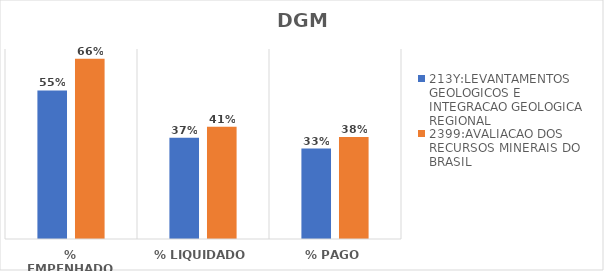
| Category | 213Y:LEVANTAMENTOS GEOLOGICOS E INTEGRACAO GEOLOGICA REGIONAL | 2399:AVALIACAO DOS RECURSOS MINERAIS DO BRASIL |
|---|---|---|
| % EMPENHADO | 0.547 | 0.664 |
| % LIQUIDADO | 0.373 | 0.413 |
| % PAGO | 0.333 | 0.375 |